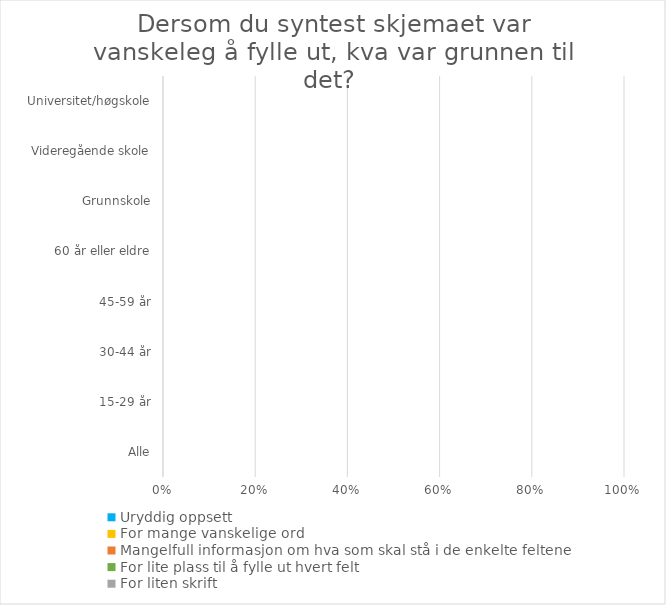
| Category | Uryddig oppsett | For mange vanskelige ord | Mangelfull informasjon om hva som skal stå i de enkelte feltene | For lite plass til å fylle ut hvert felt | For liten skrift |
|---|---|---|---|---|---|
| Alle | 0 | 0 | 0 | 0 | 0 |
| 15-29 år | 0 | 0 | 0 | 0 | 0 |
| 30-44 år | 0 | 0 | 0 | 0 | 0 |
| 45-59 år | 0 | 0 | 0 | 0 | 0 |
| 60 år eller eldre | 0 | 0 | 0 | 0 | 0 |
| Grunnskole | 0 | 0 | 0 | 0 | 0 |
| Videregående skole | 0 | 0 | 0 | 0 | 0 |
| Universitet/høgskole | 0 | 0 | 0 | 0 | 0 |